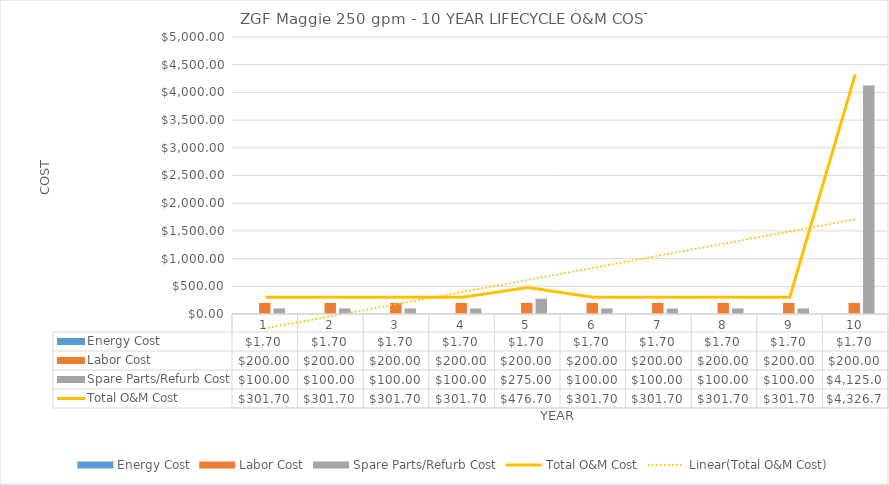
| Category | Energy Cost | Labor Cost | Spare Parts/Refurb Cost |
|---|---|---|---|
| 0 | 1.698 | 200 | 100 |
| 1 | 1.698 | 200 | 100 |
| 2 | 1.698 | 200 | 100 |
| 3 | 1.698 | 200 | 100 |
| 4 | 1.698 | 200 | 275 |
| 5 | 1.698 | 200 | 100 |
| 6 | 1.698 | 200 | 100 |
| 7 | 1.698 | 200 | 100 |
| 8 | 1.698 | 200 | 100 |
| 9 | 1.698 | 200 | 4125 |